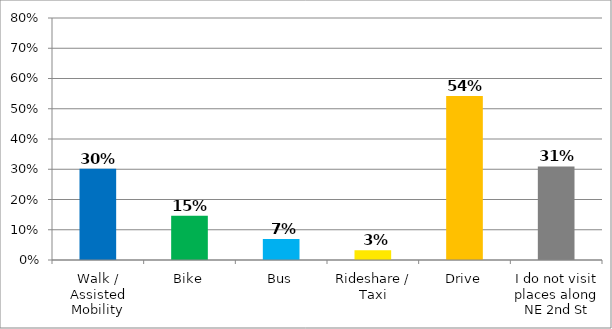
| Category | Responses |
|---|---|
| Walk / Assisted Mobility | 0.301 |
| Bike | 0.147 |
| Bus | 0.07 |
| Rideshare / Taxi | 0.032 |
| Drive | 0.542 |
| I do not visit places along NE 2nd St | 0.309 |